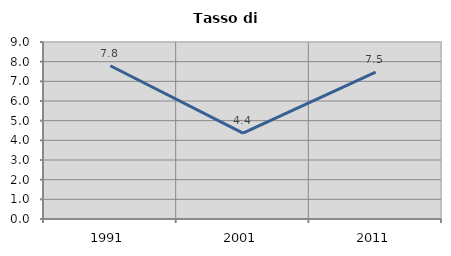
| Category | Tasso di disoccupazione   |
|---|---|
| 1991.0 | 7.792 |
| 2001.0 | 4.367 |
| 2011.0 | 7.472 |